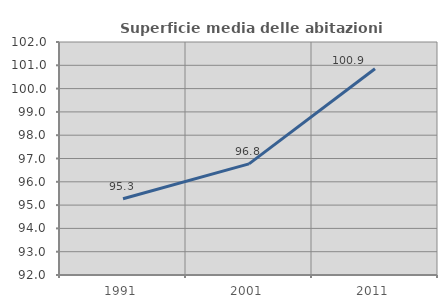
| Category | Superficie media delle abitazioni occupate |
|---|---|
| 1991.0 | 95.273 |
| 2001.0 | 96.77 |
| 2011.0 | 100.852 |